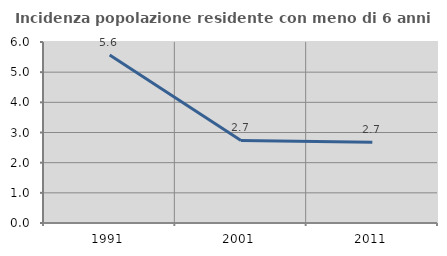
| Category | Incidenza popolazione residente con meno di 6 anni |
|---|---|
| 1991.0 | 5.565 |
| 2001.0 | 2.737 |
| 2011.0 | 2.68 |